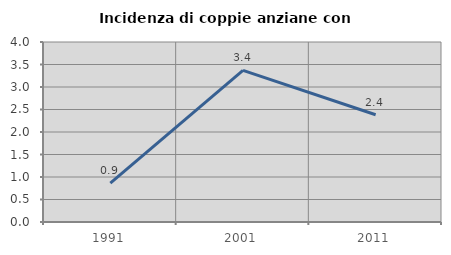
| Category | Incidenza di coppie anziane con figli |
|---|---|
| 1991.0 | 0.862 |
| 2001.0 | 3.369 |
| 2011.0 | 2.384 |